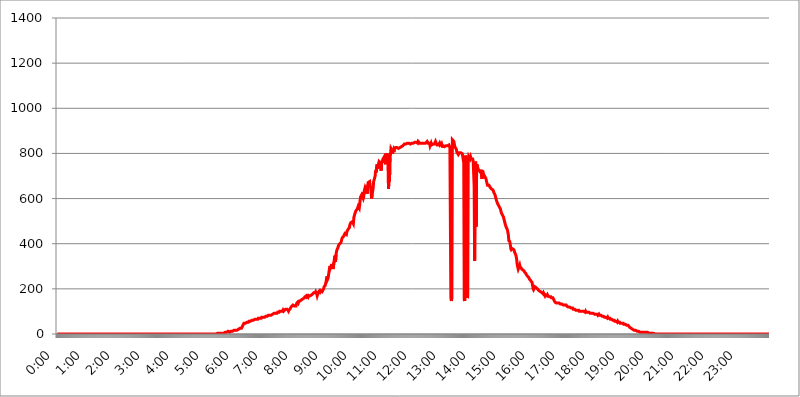
| Category | 2017.08.03. Intenzitás [W/m^2] |
|---|---|
| 0.0 | 0 |
| 0.0006944444444444445 | 0 |
| 0.001388888888888889 | 0 |
| 0.0020833333333333333 | 0 |
| 0.002777777777777778 | 0 |
| 0.003472222222222222 | 0 |
| 0.004166666666666667 | 0 |
| 0.004861111111111111 | 0 |
| 0.005555555555555556 | 0 |
| 0.0062499999999999995 | 0 |
| 0.006944444444444444 | 0 |
| 0.007638888888888889 | 0 |
| 0.008333333333333333 | 0 |
| 0.009027777777777779 | 0 |
| 0.009722222222222222 | 0 |
| 0.010416666666666666 | 0 |
| 0.011111111111111112 | 0 |
| 0.011805555555555555 | 0 |
| 0.012499999999999999 | 0 |
| 0.013194444444444444 | 0 |
| 0.013888888888888888 | 0 |
| 0.014583333333333332 | 0 |
| 0.015277777777777777 | 0 |
| 0.015972222222222224 | 0 |
| 0.016666666666666666 | 0 |
| 0.017361111111111112 | 0 |
| 0.018055555555555557 | 0 |
| 0.01875 | 0 |
| 0.019444444444444445 | 0 |
| 0.02013888888888889 | 0 |
| 0.020833333333333332 | 0 |
| 0.02152777777777778 | 0 |
| 0.022222222222222223 | 0 |
| 0.02291666666666667 | 0 |
| 0.02361111111111111 | 0 |
| 0.024305555555555556 | 0 |
| 0.024999999999999998 | 0 |
| 0.025694444444444447 | 0 |
| 0.02638888888888889 | 0 |
| 0.027083333333333334 | 0 |
| 0.027777777777777776 | 0 |
| 0.02847222222222222 | 0 |
| 0.029166666666666664 | 0 |
| 0.029861111111111113 | 0 |
| 0.030555555555555555 | 0 |
| 0.03125 | 0 |
| 0.03194444444444445 | 0 |
| 0.03263888888888889 | 0 |
| 0.03333333333333333 | 0 |
| 0.034027777777777775 | 0 |
| 0.034722222222222224 | 0 |
| 0.035416666666666666 | 0 |
| 0.036111111111111115 | 0 |
| 0.03680555555555556 | 0 |
| 0.0375 | 0 |
| 0.03819444444444444 | 0 |
| 0.03888888888888889 | 0 |
| 0.03958333333333333 | 0 |
| 0.04027777777777778 | 0 |
| 0.04097222222222222 | 0 |
| 0.041666666666666664 | 0 |
| 0.042361111111111106 | 0 |
| 0.04305555555555556 | 0 |
| 0.043750000000000004 | 0 |
| 0.044444444444444446 | 0 |
| 0.04513888888888889 | 0 |
| 0.04583333333333334 | 0 |
| 0.04652777777777778 | 0 |
| 0.04722222222222222 | 0 |
| 0.04791666666666666 | 0 |
| 0.04861111111111111 | 0 |
| 0.049305555555555554 | 0 |
| 0.049999999999999996 | 0 |
| 0.05069444444444445 | 0 |
| 0.051388888888888894 | 0 |
| 0.052083333333333336 | 0 |
| 0.05277777777777778 | 0 |
| 0.05347222222222222 | 0 |
| 0.05416666666666667 | 0 |
| 0.05486111111111111 | 0 |
| 0.05555555555555555 | 0 |
| 0.05625 | 0 |
| 0.05694444444444444 | 0 |
| 0.057638888888888885 | 0 |
| 0.05833333333333333 | 0 |
| 0.05902777777777778 | 0 |
| 0.059722222222222225 | 0 |
| 0.06041666666666667 | 0 |
| 0.061111111111111116 | 0 |
| 0.06180555555555556 | 0 |
| 0.0625 | 0 |
| 0.06319444444444444 | 0 |
| 0.06388888888888888 | 0 |
| 0.06458333333333334 | 0 |
| 0.06527777777777778 | 0 |
| 0.06597222222222222 | 0 |
| 0.06666666666666667 | 0 |
| 0.06736111111111111 | 0 |
| 0.06805555555555555 | 0 |
| 0.06874999999999999 | 0 |
| 0.06944444444444443 | 0 |
| 0.07013888888888889 | 0 |
| 0.07083333333333333 | 0 |
| 0.07152777777777779 | 0 |
| 0.07222222222222223 | 0 |
| 0.07291666666666667 | 0 |
| 0.07361111111111111 | 0 |
| 0.07430555555555556 | 0 |
| 0.075 | 0 |
| 0.07569444444444444 | 0 |
| 0.0763888888888889 | 0 |
| 0.07708333333333334 | 0 |
| 0.07777777777777778 | 0 |
| 0.07847222222222222 | 0 |
| 0.07916666666666666 | 0 |
| 0.0798611111111111 | 0 |
| 0.08055555555555556 | 0 |
| 0.08125 | 0 |
| 0.08194444444444444 | 0 |
| 0.08263888888888889 | 0 |
| 0.08333333333333333 | 0 |
| 0.08402777777777777 | 0 |
| 0.08472222222222221 | 0 |
| 0.08541666666666665 | 0 |
| 0.08611111111111112 | 0 |
| 0.08680555555555557 | 0 |
| 0.08750000000000001 | 0 |
| 0.08819444444444445 | 0 |
| 0.08888888888888889 | 0 |
| 0.08958333333333333 | 0 |
| 0.09027777777777778 | 0 |
| 0.09097222222222222 | 0 |
| 0.09166666666666667 | 0 |
| 0.09236111111111112 | 0 |
| 0.09305555555555556 | 0 |
| 0.09375 | 0 |
| 0.09444444444444444 | 0 |
| 0.09513888888888888 | 0 |
| 0.09583333333333333 | 0 |
| 0.09652777777777777 | 0 |
| 0.09722222222222222 | 0 |
| 0.09791666666666667 | 0 |
| 0.09861111111111111 | 0 |
| 0.09930555555555555 | 0 |
| 0.09999999999999999 | 0 |
| 0.10069444444444443 | 0 |
| 0.1013888888888889 | 0 |
| 0.10208333333333335 | 0 |
| 0.10277777777777779 | 0 |
| 0.10347222222222223 | 0 |
| 0.10416666666666667 | 0 |
| 0.10486111111111111 | 0 |
| 0.10555555555555556 | 0 |
| 0.10625 | 0 |
| 0.10694444444444444 | 0 |
| 0.1076388888888889 | 0 |
| 0.10833333333333334 | 0 |
| 0.10902777777777778 | 0 |
| 0.10972222222222222 | 0 |
| 0.1111111111111111 | 0 |
| 0.11180555555555556 | 0 |
| 0.11180555555555556 | 0 |
| 0.1125 | 0 |
| 0.11319444444444444 | 0 |
| 0.11388888888888889 | 0 |
| 0.11458333333333333 | 0 |
| 0.11527777777777777 | 0 |
| 0.11597222222222221 | 0 |
| 0.11666666666666665 | 0 |
| 0.1173611111111111 | 0 |
| 0.11805555555555557 | 0 |
| 0.11944444444444445 | 0 |
| 0.12013888888888889 | 0 |
| 0.12083333333333333 | 0 |
| 0.12152777777777778 | 0 |
| 0.12222222222222223 | 0 |
| 0.12291666666666667 | 0 |
| 0.12291666666666667 | 0 |
| 0.12361111111111112 | 0 |
| 0.12430555555555556 | 0 |
| 0.125 | 0 |
| 0.12569444444444444 | 0 |
| 0.12638888888888888 | 0 |
| 0.12708333333333333 | 0 |
| 0.16875 | 0 |
| 0.12847222222222224 | 0 |
| 0.12916666666666668 | 0 |
| 0.12986111111111112 | 0 |
| 0.13055555555555556 | 0 |
| 0.13125 | 0 |
| 0.13194444444444445 | 0 |
| 0.1326388888888889 | 0 |
| 0.13333333333333333 | 0 |
| 0.13402777777777777 | 0 |
| 0.13402777777777777 | 0 |
| 0.13472222222222222 | 0 |
| 0.13541666666666666 | 0 |
| 0.1361111111111111 | 0 |
| 0.13749999999999998 | 0 |
| 0.13819444444444443 | 0 |
| 0.1388888888888889 | 0 |
| 0.13958333333333334 | 0 |
| 0.14027777777777778 | 0 |
| 0.14097222222222222 | 0 |
| 0.14166666666666666 | 0 |
| 0.1423611111111111 | 0 |
| 0.14305555555555557 | 0 |
| 0.14375000000000002 | 0 |
| 0.14444444444444446 | 0 |
| 0.1451388888888889 | 0 |
| 0.1451388888888889 | 0 |
| 0.14652777777777778 | 0 |
| 0.14722222222222223 | 0 |
| 0.14791666666666667 | 0 |
| 0.1486111111111111 | 0 |
| 0.14930555555555555 | 0 |
| 0.15 | 0 |
| 0.15069444444444444 | 0 |
| 0.15138888888888888 | 0 |
| 0.15208333333333332 | 0 |
| 0.15277777777777776 | 0 |
| 0.15347222222222223 | 0 |
| 0.15416666666666667 | 0 |
| 0.15486111111111112 | 0 |
| 0.15555555555555556 | 0 |
| 0.15625 | 0 |
| 0.15694444444444444 | 0 |
| 0.15763888888888888 | 0 |
| 0.15833333333333333 | 0 |
| 0.15902777777777777 | 0 |
| 0.15972222222222224 | 0 |
| 0.16041666666666668 | 0 |
| 0.16111111111111112 | 0 |
| 0.16180555555555556 | 0 |
| 0.1625 | 0 |
| 0.16319444444444445 | 0 |
| 0.1638888888888889 | 0 |
| 0.16458333333333333 | 0 |
| 0.16527777777777777 | 0 |
| 0.16597222222222222 | 0 |
| 0.16666666666666666 | 0 |
| 0.1673611111111111 | 0 |
| 0.16805555555555554 | 0 |
| 0.16874999999999998 | 0 |
| 0.16944444444444443 | 0 |
| 0.17013888888888887 | 0 |
| 0.1708333333333333 | 0 |
| 0.17152777777777775 | 0 |
| 0.17222222222222225 | 0 |
| 0.1729166666666667 | 0 |
| 0.17361111111111113 | 0 |
| 0.17430555555555557 | 0 |
| 0.17500000000000002 | 0 |
| 0.17569444444444446 | 0 |
| 0.1763888888888889 | 0 |
| 0.17708333333333334 | 0 |
| 0.17777777777777778 | 0 |
| 0.17847222222222223 | 0 |
| 0.17916666666666667 | 0 |
| 0.1798611111111111 | 0 |
| 0.18055555555555555 | 0 |
| 0.18125 | 0 |
| 0.18194444444444444 | 0 |
| 0.1826388888888889 | 0 |
| 0.18333333333333335 | 0 |
| 0.1840277777777778 | 0 |
| 0.18472222222222223 | 0 |
| 0.18541666666666667 | 0 |
| 0.18611111111111112 | 0 |
| 0.18680555555555556 | 0 |
| 0.1875 | 0 |
| 0.18819444444444444 | 0 |
| 0.18888888888888888 | 0 |
| 0.18958333333333333 | 0 |
| 0.19027777777777777 | 0 |
| 0.1909722222222222 | 0 |
| 0.19166666666666665 | 0 |
| 0.19236111111111112 | 0 |
| 0.19305555555555554 | 0 |
| 0.19375 | 0 |
| 0.19444444444444445 | 0 |
| 0.1951388888888889 | 0 |
| 0.19583333333333333 | 0 |
| 0.19652777777777777 | 0 |
| 0.19722222222222222 | 0 |
| 0.19791666666666666 | 0 |
| 0.1986111111111111 | 0 |
| 0.19930555555555554 | 0 |
| 0.19999999999999998 | 0 |
| 0.20069444444444443 | 0 |
| 0.20138888888888887 | 0 |
| 0.2020833333333333 | 0 |
| 0.2027777777777778 | 0 |
| 0.2034722222222222 | 0 |
| 0.2041666666666667 | 0 |
| 0.20486111111111113 | 0 |
| 0.20555555555555557 | 0 |
| 0.20625000000000002 | 0 |
| 0.20694444444444446 | 0 |
| 0.2076388888888889 | 0 |
| 0.20833333333333334 | 0 |
| 0.20902777777777778 | 0 |
| 0.20972222222222223 | 0 |
| 0.21041666666666667 | 0 |
| 0.2111111111111111 | 0 |
| 0.21180555555555555 | 0 |
| 0.2125 | 0 |
| 0.21319444444444444 | 0 |
| 0.2138888888888889 | 0 |
| 0.21458333333333335 | 0 |
| 0.2152777777777778 | 0 |
| 0.21597222222222223 | 0 |
| 0.21666666666666667 | 0 |
| 0.21736111111111112 | 0 |
| 0.21805555555555556 | 0 |
| 0.21875 | 0 |
| 0.21944444444444444 | 0 |
| 0.22013888888888888 | 0 |
| 0.22083333333333333 | 0 |
| 0.22152777777777777 | 0 |
| 0.2222222222222222 | 0 |
| 0.22291666666666665 | 0 |
| 0.2236111111111111 | 0 |
| 0.22430555555555556 | 0 |
| 0.225 | 3.525 |
| 0.22569444444444445 | 0 |
| 0.2263888888888889 | 3.525 |
| 0.22708333333333333 | 3.525 |
| 0.22777777777777777 | 3.525 |
| 0.22847222222222222 | 3.525 |
| 0.22916666666666666 | 3.525 |
| 0.2298611111111111 | 3.525 |
| 0.23055555555555554 | 3.525 |
| 0.23124999999999998 | 3.525 |
| 0.23194444444444443 | 3.525 |
| 0.23263888888888887 | 3.525 |
| 0.2333333333333333 | 3.525 |
| 0.2340277777777778 | 7.887 |
| 0.2347222222222222 | 7.887 |
| 0.2354166666666667 | 7.887 |
| 0.23611111111111113 | 7.887 |
| 0.23680555555555557 | 7.887 |
| 0.23750000000000002 | 7.887 |
| 0.23819444444444446 | 7.887 |
| 0.2388888888888889 | 7.887 |
| 0.23958333333333334 | 12.257 |
| 0.24027777777777778 | 7.887 |
| 0.24097222222222223 | 12.257 |
| 0.24166666666666667 | 7.887 |
| 0.2423611111111111 | 12.257 |
| 0.24305555555555555 | 12.257 |
| 0.24375 | 12.257 |
| 0.24444444444444446 | 12.257 |
| 0.24513888888888888 | 12.257 |
| 0.24583333333333335 | 12.257 |
| 0.2465277777777778 | 12.257 |
| 0.24722222222222223 | 16.636 |
| 0.24791666666666667 | 16.636 |
| 0.24861111111111112 | 16.636 |
| 0.24930555555555556 | 16.636 |
| 0.25 | 16.636 |
| 0.25069444444444444 | 16.636 |
| 0.2513888888888889 | 16.636 |
| 0.2520833333333333 | 16.636 |
| 0.25277777777777777 | 21.024 |
| 0.2534722222222222 | 21.024 |
| 0.25416666666666665 | 21.024 |
| 0.2548611111111111 | 21.024 |
| 0.2555555555555556 | 21.024 |
| 0.25625000000000003 | 25.419 |
| 0.2569444444444445 | 21.024 |
| 0.2576388888888889 | 25.419 |
| 0.25833333333333336 | 25.419 |
| 0.2590277777777778 | 25.419 |
| 0.25972222222222224 | 29.823 |
| 0.2604166666666667 | 38.653 |
| 0.2611111111111111 | 43.079 |
| 0.26180555555555557 | 47.511 |
| 0.2625 | 47.511 |
| 0.26319444444444445 | 47.511 |
| 0.2638888888888889 | 47.511 |
| 0.26458333333333334 | 47.511 |
| 0.2652777777777778 | 47.511 |
| 0.2659722222222222 | 51.951 |
| 0.26666666666666666 | 51.951 |
| 0.2673611111111111 | 51.951 |
| 0.26805555555555555 | 51.951 |
| 0.26875 | 56.398 |
| 0.26944444444444443 | 56.398 |
| 0.2701388888888889 | 56.398 |
| 0.2708333333333333 | 56.398 |
| 0.27152777777777776 | 56.398 |
| 0.2722222222222222 | 56.398 |
| 0.27291666666666664 | 60.85 |
| 0.2736111111111111 | 60.85 |
| 0.2743055555555555 | 60.85 |
| 0.27499999999999997 | 60.85 |
| 0.27569444444444446 | 60.85 |
| 0.27638888888888885 | 60.85 |
| 0.27708333333333335 | 65.31 |
| 0.2777777777777778 | 65.31 |
| 0.27847222222222223 | 65.31 |
| 0.2791666666666667 | 65.31 |
| 0.2798611111111111 | 65.31 |
| 0.28055555555555556 | 65.31 |
| 0.28125 | 65.31 |
| 0.28194444444444444 | 69.775 |
| 0.2826388888888889 | 69.775 |
| 0.2833333333333333 | 69.775 |
| 0.28402777777777777 | 69.775 |
| 0.2847222222222222 | 69.775 |
| 0.28541666666666665 | 69.775 |
| 0.28611111111111115 | 69.775 |
| 0.28680555555555554 | 74.246 |
| 0.28750000000000003 | 74.246 |
| 0.2881944444444445 | 74.246 |
| 0.2888888888888889 | 74.246 |
| 0.28958333333333336 | 74.246 |
| 0.2902777777777778 | 74.246 |
| 0.29097222222222224 | 74.246 |
| 0.2916666666666667 | 74.246 |
| 0.2923611111111111 | 78.722 |
| 0.29305555555555557 | 78.722 |
| 0.29375 | 78.722 |
| 0.29444444444444445 | 78.722 |
| 0.2951388888888889 | 78.722 |
| 0.29583333333333334 | 83.205 |
| 0.2965277777777778 | 83.205 |
| 0.2972222222222222 | 83.205 |
| 0.29791666666666666 | 83.205 |
| 0.2986111111111111 | 83.205 |
| 0.29930555555555555 | 83.205 |
| 0.3 | 83.205 |
| 0.30069444444444443 | 83.205 |
| 0.3013888888888889 | 83.205 |
| 0.3020833333333333 | 87.692 |
| 0.30277777777777776 | 87.692 |
| 0.3034722222222222 | 87.692 |
| 0.30416666666666664 | 92.184 |
| 0.3048611111111111 | 92.184 |
| 0.3055555555555555 | 92.184 |
| 0.30624999999999997 | 92.184 |
| 0.3069444444444444 | 92.184 |
| 0.3076388888888889 | 92.184 |
| 0.30833333333333335 | 92.184 |
| 0.3090277777777778 | 96.682 |
| 0.30972222222222223 | 96.682 |
| 0.3104166666666667 | 96.682 |
| 0.3111111111111111 | 96.682 |
| 0.31180555555555556 | 101.184 |
| 0.3125 | 101.184 |
| 0.31319444444444444 | 101.184 |
| 0.3138888888888889 | 101.184 |
| 0.3145833333333333 | 101.184 |
| 0.31527777777777777 | 101.184 |
| 0.3159722222222222 | 101.184 |
| 0.31666666666666665 | 105.69 |
| 0.31736111111111115 | 101.184 |
| 0.31805555555555554 | 101.184 |
| 0.31875000000000003 | 105.69 |
| 0.3194444444444445 | 105.69 |
| 0.3201388888888889 | 110.201 |
| 0.32083333333333336 | 110.201 |
| 0.3215277777777778 | 110.201 |
| 0.32222222222222224 | 110.201 |
| 0.3229166666666667 | 110.201 |
| 0.3236111111111111 | 105.69 |
| 0.32430555555555557 | 101.184 |
| 0.325 | 105.69 |
| 0.32569444444444445 | 105.69 |
| 0.3263888888888889 | 110.201 |
| 0.32708333333333334 | 114.716 |
| 0.3277777777777778 | 119.235 |
| 0.3284722222222222 | 119.235 |
| 0.32916666666666666 | 123.758 |
| 0.3298611111111111 | 123.758 |
| 0.33055555555555555 | 128.284 |
| 0.33125 | 128.284 |
| 0.33194444444444443 | 128.284 |
| 0.3326388888888889 | 123.758 |
| 0.3333333333333333 | 123.758 |
| 0.3340277777777778 | 123.758 |
| 0.3347222222222222 | 123.758 |
| 0.3354166666666667 | 132.814 |
| 0.3361111111111111 | 137.347 |
| 0.3368055555555556 | 137.347 |
| 0.33749999999999997 | 141.884 |
| 0.33819444444444446 | 137.347 |
| 0.33888888888888885 | 141.884 |
| 0.33958333333333335 | 141.884 |
| 0.34027777777777773 | 146.423 |
| 0.34097222222222223 | 146.423 |
| 0.3416666666666666 | 146.423 |
| 0.3423611111111111 | 150.964 |
| 0.3430555555555555 | 150.964 |
| 0.34375 | 150.964 |
| 0.3444444444444445 | 155.509 |
| 0.3451388888888889 | 155.509 |
| 0.3458333333333334 | 155.509 |
| 0.34652777777777777 | 160.056 |
| 0.34722222222222227 | 164.605 |
| 0.34791666666666665 | 164.605 |
| 0.34861111111111115 | 164.605 |
| 0.34930555555555554 | 169.156 |
| 0.35000000000000003 | 164.605 |
| 0.3506944444444444 | 164.605 |
| 0.3513888888888889 | 169.156 |
| 0.3520833333333333 | 164.605 |
| 0.3527777777777778 | 169.156 |
| 0.3534722222222222 | 169.156 |
| 0.3541666666666667 | 169.156 |
| 0.3548611111111111 | 169.156 |
| 0.35555555555555557 | 169.156 |
| 0.35625 | 169.156 |
| 0.35694444444444445 | 173.709 |
| 0.3576388888888889 | 173.709 |
| 0.35833333333333334 | 178.264 |
| 0.3590277777777778 | 178.264 |
| 0.3597222222222222 | 182.82 |
| 0.36041666666666666 | 182.82 |
| 0.3611111111111111 | 182.82 |
| 0.36180555555555555 | 182.82 |
| 0.3625 | 187.378 |
| 0.36319444444444443 | 182.82 |
| 0.3638888888888889 | 178.264 |
| 0.3645833333333333 | 169.156 |
| 0.3652777777777778 | 169.156 |
| 0.3659722222222222 | 182.82 |
| 0.3666666666666667 | 187.378 |
| 0.3673611111111111 | 187.378 |
| 0.3680555555555556 | 191.937 |
| 0.36874999999999997 | 187.378 |
| 0.36944444444444446 | 191.937 |
| 0.37013888888888885 | 191.937 |
| 0.37083333333333335 | 191.937 |
| 0.37152777777777773 | 187.378 |
| 0.37222222222222223 | 187.378 |
| 0.3729166666666666 | 187.378 |
| 0.3736111111111111 | 201.058 |
| 0.3743055555555555 | 210.182 |
| 0.375 | 210.182 |
| 0.3756944444444445 | 214.746 |
| 0.3763888888888889 | 214.746 |
| 0.3770833333333334 | 233 |
| 0.37777777777777777 | 246.689 |
| 0.37847222222222227 | 255.813 |
| 0.37916666666666665 | 242.127 |
| 0.37986111111111115 | 246.689 |
| 0.38055555555555554 | 246.689 |
| 0.38125000000000003 | 278.603 |
| 0.3819444444444444 | 292.259 |
| 0.3826388888888889 | 301.354 |
| 0.3833333333333333 | 292.259 |
| 0.3840277777777778 | 296.808 |
| 0.3847222222222222 | 310.44 |
| 0.3854166666666667 | 301.354 |
| 0.3861111111111111 | 296.808 |
| 0.38680555555555557 | 287.709 |
| 0.3875 | 287.709 |
| 0.38819444444444445 | 319.517 |
| 0.3888888888888889 | 337.639 |
| 0.38958333333333334 | 346.682 |
| 0.3902777777777778 | 319.517 |
| 0.3909722222222222 | 351.198 |
| 0.39166666666666666 | 364.728 |
| 0.3923611111111111 | 373.729 |
| 0.39305555555555555 | 378.224 |
| 0.39375 | 382.715 |
| 0.39444444444444443 | 391.685 |
| 0.3951388888888889 | 396.164 |
| 0.3958333333333333 | 396.164 |
| 0.3965277777777778 | 400.638 |
| 0.3972222222222222 | 400.638 |
| 0.3979166666666667 | 405.108 |
| 0.3986111111111111 | 414.035 |
| 0.3993055555555556 | 422.943 |
| 0.39999999999999997 | 427.39 |
| 0.40069444444444446 | 427.39 |
| 0.40138888888888885 | 431.833 |
| 0.40208333333333335 | 431.833 |
| 0.40277777777777773 | 431.833 |
| 0.40347222222222223 | 445.129 |
| 0.4041666666666666 | 445.129 |
| 0.4048611111111111 | 440.702 |
| 0.4055555555555555 | 440.702 |
| 0.40625 | 453.968 |
| 0.4069444444444445 | 458.38 |
| 0.4076388888888889 | 462.786 |
| 0.4083333333333334 | 467.187 |
| 0.40902777777777777 | 467.187 |
| 0.40972222222222227 | 471.582 |
| 0.41041666666666665 | 484.735 |
| 0.41111111111111115 | 489.108 |
| 0.41180555555555554 | 493.475 |
| 0.41250000000000003 | 497.836 |
| 0.4131944444444444 | 489.108 |
| 0.4138888888888889 | 497.836 |
| 0.4145833333333333 | 497.836 |
| 0.4152777777777778 | 489.108 |
| 0.4159722222222222 | 515.223 |
| 0.4166666666666667 | 523.88 |
| 0.4173611111111111 | 532.513 |
| 0.41805555555555557 | 536.82 |
| 0.41875 | 545.416 |
| 0.41944444444444445 | 549.704 |
| 0.4201388888888889 | 541.121 |
| 0.42083333333333334 | 553.986 |
| 0.4215277777777778 | 558.261 |
| 0.4222222222222222 | 566.793 |
| 0.42291666666666666 | 562.53 |
| 0.4236111111111111 | 558.261 |
| 0.42430555555555555 | 575.299 |
| 0.425 | 600.661 |
| 0.42569444444444443 | 609.062 |
| 0.4263888888888889 | 604.864 |
| 0.4270833333333333 | 617.436 |
| 0.4277777777777778 | 617.436 |
| 0.4284722222222222 | 613.252 |
| 0.4291666666666667 | 600.661 |
| 0.4298611111111111 | 609.062 |
| 0.4305555555555556 | 634.105 |
| 0.43124999999999997 | 642.4 |
| 0.43194444444444446 | 650.667 |
| 0.43263888888888885 | 654.791 |
| 0.43333333333333335 | 642.4 |
| 0.43402777777777773 | 638.256 |
| 0.43472222222222223 | 621.613 |
| 0.4354166666666666 | 658.909 |
| 0.4361111111111111 | 671.22 |
| 0.4368055555555555 | 671.22 |
| 0.4375 | 675.311 |
| 0.4381944444444445 | 675.311 |
| 0.4388888888888889 | 658.909 |
| 0.4395833333333334 | 646.537 |
| 0.44027777777777777 | 642.4 |
| 0.44097222222222227 | 600.661 |
| 0.44166666666666665 | 617.436 |
| 0.44236111111111115 | 617.436 |
| 0.44305555555555554 | 646.537 |
| 0.44375000000000003 | 675.311 |
| 0.4444444444444444 | 683.473 |
| 0.4451388888888889 | 687.544 |
| 0.4458333333333333 | 699.717 |
| 0.4465277777777778 | 723.889 |
| 0.4472222222222222 | 715.858 |
| 0.4479166666666667 | 739.877 |
| 0.4486111111111111 | 751.803 |
| 0.44930555555555557 | 731.896 |
| 0.45 | 739.877 |
| 0.45069444444444445 | 755.766 |
| 0.4513888888888889 | 763.674 |
| 0.45208333333333334 | 763.674 |
| 0.4527777777777778 | 759.723 |
| 0.4534722222222222 | 755.766 |
| 0.45416666666666666 | 723.889 |
| 0.4548611111111111 | 751.803 |
| 0.45555555555555555 | 767.62 |
| 0.45625 | 759.723 |
| 0.45694444444444443 | 775.492 |
| 0.4576388888888889 | 779.42 |
| 0.4583333333333333 | 783.342 |
| 0.4590277777777778 | 779.42 |
| 0.4597222222222222 | 767.62 |
| 0.4604166666666667 | 751.803 |
| 0.4611111111111111 | 798.974 |
| 0.4618055555555556 | 779.42 |
| 0.46249999999999997 | 798.974 |
| 0.46319444444444446 | 791.169 |
| 0.46388888888888885 | 751.803 |
| 0.46458333333333335 | 642.4 |
| 0.46527777777777773 | 687.544 |
| 0.46597222222222223 | 675.311 |
| 0.4666666666666666 | 783.342 |
| 0.4673611111111111 | 795.074 |
| 0.4680555555555555 | 822.26 |
| 0.46875 | 818.392 |
| 0.4694444444444445 | 814.519 |
| 0.4701388888888889 | 798.974 |
| 0.4708333333333334 | 802.868 |
| 0.47152777777777777 | 814.519 |
| 0.47222222222222227 | 806.757 |
| 0.47291666666666665 | 818.392 |
| 0.47361111111111115 | 822.26 |
| 0.47430555555555554 | 826.123 |
| 0.47500000000000003 | 822.26 |
| 0.4756944444444444 | 826.123 |
| 0.4763888888888889 | 826.123 |
| 0.4770833333333333 | 826.123 |
| 0.4777777777777778 | 826.123 |
| 0.4784722222222222 | 822.26 |
| 0.4791666666666667 | 826.123 |
| 0.4798611111111111 | 826.123 |
| 0.48055555555555557 | 826.123 |
| 0.48125 | 829.981 |
| 0.48194444444444445 | 829.981 |
| 0.4826388888888889 | 829.981 |
| 0.48333333333333334 | 829.981 |
| 0.4840277777777778 | 829.981 |
| 0.4847222222222222 | 833.834 |
| 0.48541666666666666 | 833.834 |
| 0.4861111111111111 | 833.834 |
| 0.48680555555555555 | 841.526 |
| 0.4875 | 841.526 |
| 0.48819444444444443 | 837.682 |
| 0.4888888888888889 | 841.526 |
| 0.4895833333333333 | 841.526 |
| 0.4902777777777778 | 845.365 |
| 0.4909722222222222 | 845.365 |
| 0.4916666666666667 | 845.365 |
| 0.4923611111111111 | 845.365 |
| 0.4930555555555556 | 845.365 |
| 0.49374999999999997 | 841.526 |
| 0.49444444444444446 | 841.526 |
| 0.49513888888888885 | 841.526 |
| 0.49583333333333335 | 845.365 |
| 0.49652777777777773 | 841.526 |
| 0.49722222222222223 | 845.365 |
| 0.4979166666666666 | 845.365 |
| 0.4986111111111111 | 845.365 |
| 0.4993055555555555 | 845.365 |
| 0.5 | 845.365 |
| 0.5006944444444444 | 845.365 |
| 0.5013888888888889 | 849.199 |
| 0.5020833333333333 | 849.199 |
| 0.5027777777777778 | 849.199 |
| 0.5034722222222222 | 849.199 |
| 0.5041666666666667 | 853.029 |
| 0.5048611111111111 | 849.199 |
| 0.5055555555555555 | 845.365 |
| 0.50625 | 853.029 |
| 0.5069444444444444 | 853.029 |
| 0.5076388888888889 | 849.199 |
| 0.5083333333333333 | 845.365 |
| 0.5090277777777777 | 845.365 |
| 0.5097222222222222 | 845.365 |
| 0.5104166666666666 | 845.365 |
| 0.5111111111111112 | 845.365 |
| 0.5118055555555555 | 849.199 |
| 0.5125000000000001 | 845.365 |
| 0.5131944444444444 | 845.365 |
| 0.513888888888889 | 849.199 |
| 0.5145833333333333 | 845.365 |
| 0.5152777777777778 | 841.526 |
| 0.5159722222222222 | 845.365 |
| 0.5166666666666667 | 845.365 |
| 0.517361111111111 | 845.365 |
| 0.5180555555555556 | 849.199 |
| 0.5187499999999999 | 853.029 |
| 0.5194444444444445 | 853.029 |
| 0.5201388888888888 | 845.365 |
| 0.5208333333333334 | 845.365 |
| 0.5215277777777778 | 845.365 |
| 0.5222222222222223 | 845.365 |
| 0.5229166666666667 | 833.834 |
| 0.5236111111111111 | 833.834 |
| 0.5243055555555556 | 845.365 |
| 0.525 | 837.682 |
| 0.5256944444444445 | 837.682 |
| 0.5263888888888889 | 841.526 |
| 0.5270833333333333 | 841.526 |
| 0.5277777777777778 | 841.526 |
| 0.5284722222222222 | 845.365 |
| 0.5291666666666667 | 841.526 |
| 0.5298611111111111 | 845.365 |
| 0.5305555555555556 | 853.029 |
| 0.53125 | 853.029 |
| 0.5319444444444444 | 849.199 |
| 0.5326388888888889 | 837.682 |
| 0.5333333333333333 | 837.682 |
| 0.5340277777777778 | 837.682 |
| 0.5347222222222222 | 837.682 |
| 0.5354166666666667 | 837.682 |
| 0.5361111111111111 | 845.365 |
| 0.5368055555555555 | 837.682 |
| 0.5375 | 841.526 |
| 0.5381944444444444 | 837.682 |
| 0.5388888888888889 | 845.365 |
| 0.5395833333333333 | 837.682 |
| 0.5402777777777777 | 826.123 |
| 0.5409722222222222 | 833.834 |
| 0.5416666666666666 | 837.682 |
| 0.5423611111111112 | 829.981 |
| 0.5430555555555555 | 829.981 |
| 0.5437500000000001 | 829.981 |
| 0.5444444444444444 | 829.981 |
| 0.545138888888889 | 833.834 |
| 0.5458333333333333 | 837.682 |
| 0.5465277777777778 | 829.981 |
| 0.5472222222222222 | 833.834 |
| 0.5479166666666667 | 837.682 |
| 0.548611111111111 | 837.682 |
| 0.5493055555555556 | 837.682 |
| 0.5499999999999999 | 833.834 |
| 0.5506944444444445 | 826.123 |
| 0.5513888888888888 | 826.123 |
| 0.5520833333333334 | 160.056 |
| 0.5527777777777778 | 146.423 |
| 0.5534722222222223 | 164.605 |
| 0.5541666666666667 | 860.676 |
| 0.5548611111111111 | 864.493 |
| 0.5555555555555556 | 856.855 |
| 0.55625 | 853.029 |
| 0.5569444444444445 | 841.526 |
| 0.5576388888888889 | 829.981 |
| 0.5583333333333333 | 833.834 |
| 0.5590277777777778 | 829.981 |
| 0.5597222222222222 | 818.392 |
| 0.5604166666666667 | 806.757 |
| 0.5611111111111111 | 802.868 |
| 0.5618055555555556 | 806.757 |
| 0.5625 | 795.074 |
| 0.5631944444444444 | 798.974 |
| 0.5638888888888889 | 802.868 |
| 0.5645833333333333 | 798.974 |
| 0.5652777777777778 | 802.868 |
| 0.5659722222222222 | 802.868 |
| 0.5666666666666667 | 798.974 |
| 0.5673611111111111 | 802.868 |
| 0.5680555555555555 | 798.974 |
| 0.56875 | 798.974 |
| 0.5694444444444444 | 795.074 |
| 0.5701388888888889 | 759.723 |
| 0.5708333333333333 | 150.964 |
| 0.5715277777777777 | 146.423 |
| 0.5722222222222222 | 703.762 |
| 0.5729166666666666 | 791.169 |
| 0.5736111111111112 | 791.169 |
| 0.5743055555555555 | 787.258 |
| 0.5750000000000001 | 160.056 |
| 0.5756944444444444 | 164.605 |
| 0.576388888888889 | 767.62 |
| 0.5770833333333333 | 787.258 |
| 0.5777777777777778 | 783.342 |
| 0.5784722222222222 | 783.342 |
| 0.5791666666666667 | 775.492 |
| 0.579861111111111 | 783.342 |
| 0.5805555555555556 | 775.492 |
| 0.5812499999999999 | 775.492 |
| 0.5819444444444445 | 775.492 |
| 0.5826388888888888 | 775.492 |
| 0.5833333333333334 | 767.62 |
| 0.5840277777777778 | 763.674 |
| 0.5847222222222223 | 654.791 |
| 0.5854166666666667 | 324.052 |
| 0.5861111111111111 | 743.859 |
| 0.5868055555555556 | 763.674 |
| 0.5875 | 475.972 |
| 0.5881944444444445 | 751.803 |
| 0.5888888888888889 | 747.834 |
| 0.5895833333333333 | 739.877 |
| 0.5902777777777778 | 731.896 |
| 0.5909722222222222 | 731.896 |
| 0.5916666666666667 | 723.889 |
| 0.5923611111111111 | 719.877 |
| 0.5930555555555556 | 723.889 |
| 0.59375 | 715.858 |
| 0.5944444444444444 | 727.896 |
| 0.5951388888888889 | 727.896 |
| 0.5958333333333333 | 687.544 |
| 0.5965277777777778 | 723.889 |
| 0.5972222222222222 | 711.832 |
| 0.5979166666666667 | 711.832 |
| 0.5986111111111111 | 703.762 |
| 0.5993055555555555 | 699.717 |
| 0.6 | 695.666 |
| 0.6006944444444444 | 691.608 |
| 0.6013888888888889 | 687.544 |
| 0.6020833333333333 | 675.311 |
| 0.6027777777777777 | 675.311 |
| 0.6034722222222222 | 658.909 |
| 0.6041666666666666 | 658.909 |
| 0.6048611111111112 | 658.909 |
| 0.6055555555555555 | 658.909 |
| 0.6062500000000001 | 654.791 |
| 0.6069444444444444 | 650.667 |
| 0.607638888888889 | 646.537 |
| 0.6083333333333333 | 646.537 |
| 0.6090277777777778 | 642.4 |
| 0.6097222222222222 | 638.256 |
| 0.6104166666666667 | 642.4 |
| 0.611111111111111 | 638.256 |
| 0.6118055555555556 | 634.105 |
| 0.6124999999999999 | 625.784 |
| 0.6131944444444445 | 621.613 |
| 0.6138888888888888 | 617.436 |
| 0.6145833333333334 | 609.062 |
| 0.6152777777777778 | 600.661 |
| 0.6159722222222223 | 592.233 |
| 0.6166666666666667 | 588.009 |
| 0.6173611111111111 | 579.542 |
| 0.6180555555555556 | 575.299 |
| 0.61875 | 571.049 |
| 0.6194444444444445 | 566.793 |
| 0.6201388888888889 | 562.53 |
| 0.6208333333333333 | 558.261 |
| 0.6215277777777778 | 553.986 |
| 0.6222222222222222 | 545.416 |
| 0.6229166666666667 | 536.82 |
| 0.6236111111111111 | 532.513 |
| 0.6243055555555556 | 528.2 |
| 0.625 | 523.88 |
| 0.6256944444444444 | 519.555 |
| 0.6263888888888889 | 510.885 |
| 0.6270833333333333 | 502.192 |
| 0.6277777777777778 | 493.475 |
| 0.6284722222222222 | 484.735 |
| 0.6291666666666667 | 480.356 |
| 0.6298611111111111 | 471.582 |
| 0.6305555555555555 | 471.582 |
| 0.63125 | 462.786 |
| 0.6319444444444444 | 458.38 |
| 0.6326388888888889 | 440.702 |
| 0.6333333333333333 | 414.035 |
| 0.6340277777777777 | 414.035 |
| 0.6347222222222222 | 409.574 |
| 0.6354166666666666 | 396.164 |
| 0.6361111111111112 | 378.224 |
| 0.6368055555555555 | 373.729 |
| 0.6375000000000001 | 373.729 |
| 0.6381944444444444 | 378.224 |
| 0.638888888888889 | 378.224 |
| 0.6395833333333333 | 378.224 |
| 0.6402777777777778 | 373.729 |
| 0.6409722222222222 | 369.23 |
| 0.6416666666666667 | 360.221 |
| 0.642361111111111 | 360.221 |
| 0.6430555555555556 | 351.198 |
| 0.6437499999999999 | 342.162 |
| 0.6444444444444445 | 328.584 |
| 0.6451388888888888 | 305.898 |
| 0.6458333333333334 | 296.808 |
| 0.6465277777777778 | 287.709 |
| 0.6472222222222223 | 287.709 |
| 0.6479166666666667 | 287.709 |
| 0.6486111111111111 | 305.898 |
| 0.6493055555555556 | 296.808 |
| 0.65 | 296.808 |
| 0.6506944444444445 | 292.259 |
| 0.6513888888888889 | 287.709 |
| 0.6520833333333333 | 287.709 |
| 0.6527777777777778 | 287.709 |
| 0.6534722222222222 | 283.156 |
| 0.6541666666666667 | 283.156 |
| 0.6548611111111111 | 278.603 |
| 0.6555555555555556 | 274.047 |
| 0.65625 | 274.047 |
| 0.6569444444444444 | 269.49 |
| 0.6576388888888889 | 264.932 |
| 0.6583333333333333 | 260.373 |
| 0.6590277777777778 | 260.373 |
| 0.6597222222222222 | 255.813 |
| 0.6604166666666667 | 255.813 |
| 0.6611111111111111 | 251.251 |
| 0.6618055555555555 | 246.689 |
| 0.6625 | 242.127 |
| 0.6631944444444444 | 242.127 |
| 0.6638888888888889 | 237.564 |
| 0.6645833333333333 | 233 |
| 0.6652777777777777 | 233 |
| 0.6659722222222222 | 228.436 |
| 0.6666666666666666 | 214.746 |
| 0.6673611111111111 | 201.058 |
| 0.6680555555555556 | 196.497 |
| 0.6687500000000001 | 201.058 |
| 0.6694444444444444 | 210.182 |
| 0.6701388888888888 | 210.182 |
| 0.6708333333333334 | 210.182 |
| 0.6715277777777778 | 205.62 |
| 0.6722222222222222 | 205.62 |
| 0.6729166666666666 | 201.058 |
| 0.6736111111111112 | 201.058 |
| 0.6743055555555556 | 196.497 |
| 0.6749999999999999 | 196.497 |
| 0.6756944444444444 | 191.937 |
| 0.6763888888888889 | 191.937 |
| 0.6770833333333334 | 191.937 |
| 0.6777777777777777 | 187.378 |
| 0.6784722222222223 | 187.378 |
| 0.6791666666666667 | 187.378 |
| 0.6798611111111111 | 182.82 |
| 0.6805555555555555 | 182.82 |
| 0.68125 | 178.264 |
| 0.6819444444444445 | 182.82 |
| 0.6826388888888889 | 178.264 |
| 0.6833333333333332 | 178.264 |
| 0.6840277777777778 | 169.156 |
| 0.6847222222222222 | 173.709 |
| 0.6854166666666667 | 173.709 |
| 0.686111111111111 | 173.709 |
| 0.6868055555555556 | 169.156 |
| 0.6875 | 173.709 |
| 0.6881944444444444 | 169.156 |
| 0.688888888888889 | 169.156 |
| 0.6895833333333333 | 169.156 |
| 0.6902777777777778 | 164.605 |
| 0.6909722222222222 | 164.605 |
| 0.6916666666666668 | 164.605 |
| 0.6923611111111111 | 164.605 |
| 0.6930555555555555 | 160.056 |
| 0.69375 | 160.056 |
| 0.6944444444444445 | 160.056 |
| 0.6951388888888889 | 160.056 |
| 0.6958333333333333 | 155.509 |
| 0.6965277777777777 | 150.964 |
| 0.6972222222222223 | 146.423 |
| 0.6979166666666666 | 141.884 |
| 0.6986111111111111 | 141.884 |
| 0.6993055555555556 | 141.884 |
| 0.7000000000000001 | 137.347 |
| 0.7006944444444444 | 137.347 |
| 0.7013888888888888 | 137.347 |
| 0.7020833333333334 | 137.347 |
| 0.7027777777777778 | 137.347 |
| 0.7034722222222222 | 137.347 |
| 0.7041666666666666 | 137.347 |
| 0.7048611111111112 | 137.347 |
| 0.7055555555555556 | 132.814 |
| 0.7062499999999999 | 132.814 |
| 0.7069444444444444 | 132.814 |
| 0.7076388888888889 | 132.814 |
| 0.7083333333333334 | 132.814 |
| 0.7090277777777777 | 132.814 |
| 0.7097222222222223 | 128.284 |
| 0.7104166666666667 | 128.284 |
| 0.7111111111111111 | 128.284 |
| 0.7118055555555555 | 128.284 |
| 0.7125 | 128.284 |
| 0.7131944444444445 | 128.284 |
| 0.7138888888888889 | 128.284 |
| 0.7145833333333332 | 123.758 |
| 0.7152777777777778 | 123.758 |
| 0.7159722222222222 | 123.758 |
| 0.7166666666666667 | 119.235 |
| 0.717361111111111 | 119.235 |
| 0.7180555555555556 | 119.235 |
| 0.71875 | 119.235 |
| 0.7194444444444444 | 119.235 |
| 0.720138888888889 | 119.235 |
| 0.7208333333333333 | 114.716 |
| 0.7215277777777778 | 114.716 |
| 0.7222222222222222 | 114.716 |
| 0.7229166666666668 | 114.716 |
| 0.7236111111111111 | 110.201 |
| 0.7243055555555555 | 110.201 |
| 0.725 | 110.201 |
| 0.7256944444444445 | 110.201 |
| 0.7263888888888889 | 110.201 |
| 0.7270833333333333 | 105.69 |
| 0.7277777777777777 | 105.69 |
| 0.7284722222222223 | 105.69 |
| 0.7291666666666666 | 105.69 |
| 0.7298611111111111 | 105.69 |
| 0.7305555555555556 | 105.69 |
| 0.7312500000000001 | 105.69 |
| 0.7319444444444444 | 101.184 |
| 0.7326388888888888 | 101.184 |
| 0.7333333333333334 | 101.184 |
| 0.7340277777777778 | 101.184 |
| 0.7347222222222222 | 101.184 |
| 0.7354166666666666 | 101.184 |
| 0.7361111111111112 | 101.184 |
| 0.7368055555555556 | 101.184 |
| 0.7374999999999999 | 101.184 |
| 0.7381944444444444 | 101.184 |
| 0.7388888888888889 | 101.184 |
| 0.7395833333333334 | 101.184 |
| 0.7402777777777777 | 96.682 |
| 0.7409722222222223 | 101.184 |
| 0.7416666666666667 | 96.682 |
| 0.7423611111111111 | 96.682 |
| 0.7430555555555555 | 96.682 |
| 0.74375 | 96.682 |
| 0.7444444444444445 | 96.682 |
| 0.7451388888888889 | 96.682 |
| 0.7458333333333332 | 96.682 |
| 0.7465277777777778 | 96.682 |
| 0.7472222222222222 | 92.184 |
| 0.7479166666666667 | 92.184 |
| 0.748611111111111 | 92.184 |
| 0.7493055555555556 | 92.184 |
| 0.75 | 92.184 |
| 0.7506944444444444 | 92.184 |
| 0.751388888888889 | 92.184 |
| 0.7520833333333333 | 92.184 |
| 0.7527777777777778 | 92.184 |
| 0.7534722222222222 | 87.692 |
| 0.7541666666666668 | 87.692 |
| 0.7548611111111111 | 87.692 |
| 0.7555555555555555 | 87.692 |
| 0.75625 | 87.692 |
| 0.7569444444444445 | 87.692 |
| 0.7576388888888889 | 87.692 |
| 0.7583333333333333 | 83.205 |
| 0.7590277777777777 | 83.205 |
| 0.7597222222222223 | 87.692 |
| 0.7604166666666666 | 83.205 |
| 0.7611111111111111 | 83.205 |
| 0.7618055555555556 | 83.205 |
| 0.7625000000000001 | 83.205 |
| 0.7631944444444444 | 83.205 |
| 0.7638888888888888 | 78.722 |
| 0.7645833333333334 | 78.722 |
| 0.7652777777777778 | 78.722 |
| 0.7659722222222222 | 78.722 |
| 0.7666666666666666 | 78.722 |
| 0.7673611111111112 | 74.246 |
| 0.7680555555555556 | 74.246 |
| 0.7687499999999999 | 74.246 |
| 0.7694444444444444 | 74.246 |
| 0.7701388888888889 | 74.246 |
| 0.7708333333333334 | 74.246 |
| 0.7715277777777777 | 69.775 |
| 0.7722222222222223 | 74.246 |
| 0.7729166666666667 | 69.775 |
| 0.7736111111111111 | 69.775 |
| 0.7743055555555555 | 69.775 |
| 0.775 | 69.775 |
| 0.7756944444444445 | 65.31 |
| 0.7763888888888889 | 65.31 |
| 0.7770833333333332 | 65.31 |
| 0.7777777777777778 | 65.31 |
| 0.7784722222222222 | 65.31 |
| 0.7791666666666667 | 60.85 |
| 0.779861111111111 | 60.85 |
| 0.7805555555555556 | 60.85 |
| 0.78125 | 60.85 |
| 0.7819444444444444 | 56.398 |
| 0.782638888888889 | 56.398 |
| 0.7833333333333333 | 56.398 |
| 0.7840277777777778 | 56.398 |
| 0.7847222222222222 | 56.398 |
| 0.7854166666666668 | 51.951 |
| 0.7861111111111111 | 56.398 |
| 0.7868055555555555 | 51.951 |
| 0.7875 | 51.951 |
| 0.7881944444444445 | 51.951 |
| 0.7888888888888889 | 51.951 |
| 0.7895833333333333 | 47.511 |
| 0.7902777777777777 | 47.511 |
| 0.7909722222222223 | 47.511 |
| 0.7916666666666666 | 47.511 |
| 0.7923611111111111 | 47.511 |
| 0.7930555555555556 | 47.511 |
| 0.7937500000000001 | 47.511 |
| 0.7944444444444444 | 43.079 |
| 0.7951388888888888 | 43.079 |
| 0.7958333333333334 | 43.079 |
| 0.7965277777777778 | 43.079 |
| 0.7972222222222222 | 43.079 |
| 0.7979166666666666 | 38.653 |
| 0.7986111111111112 | 38.653 |
| 0.7993055555555556 | 38.653 |
| 0.7999999999999999 | 38.653 |
| 0.8006944444444444 | 38.653 |
| 0.8013888888888889 | 34.234 |
| 0.8020833333333334 | 34.234 |
| 0.8027777777777777 | 29.823 |
| 0.8034722222222223 | 29.823 |
| 0.8041666666666667 | 25.419 |
| 0.8048611111111111 | 25.419 |
| 0.8055555555555555 | 25.419 |
| 0.80625 | 21.024 |
| 0.8069444444444445 | 21.024 |
| 0.8076388888888889 | 21.024 |
| 0.8083333333333332 | 21.024 |
| 0.8090277777777778 | 16.636 |
| 0.8097222222222222 | 16.636 |
| 0.8104166666666667 | 16.636 |
| 0.811111111111111 | 16.636 |
| 0.8118055555555556 | 12.257 |
| 0.8125 | 12.257 |
| 0.8131944444444444 | 12.257 |
| 0.813888888888889 | 12.257 |
| 0.8145833333333333 | 12.257 |
| 0.8152777777777778 | 12.257 |
| 0.8159722222222222 | 7.887 |
| 0.8166666666666668 | 7.887 |
| 0.8173611111111111 | 7.887 |
| 0.8180555555555555 | 7.887 |
| 0.81875 | 7.887 |
| 0.8194444444444445 | 7.887 |
| 0.8201388888888889 | 7.887 |
| 0.8208333333333333 | 7.887 |
| 0.8215277777777777 | 7.887 |
| 0.8222222222222223 | 7.887 |
| 0.8229166666666666 | 7.887 |
| 0.8236111111111111 | 7.887 |
| 0.8243055555555556 | 7.887 |
| 0.8250000000000001 | 7.887 |
| 0.8256944444444444 | 7.887 |
| 0.8263888888888888 | 7.887 |
| 0.8270833333333334 | 7.887 |
| 0.8277777777777778 | 7.887 |
| 0.8284722222222222 | 7.887 |
| 0.8291666666666666 | 7.887 |
| 0.8298611111111112 | 3.525 |
| 0.8305555555555556 | 7.887 |
| 0.8312499999999999 | 3.525 |
| 0.8319444444444444 | 3.525 |
| 0.8326388888888889 | 3.525 |
| 0.8333333333333334 | 3.525 |
| 0.8340277777777777 | 3.525 |
| 0.8347222222222223 | 3.525 |
| 0.8354166666666667 | 3.525 |
| 0.8361111111111111 | 3.525 |
| 0.8368055555555555 | 3.525 |
| 0.8375 | 3.525 |
| 0.8381944444444445 | 0 |
| 0.8388888888888889 | 0 |
| 0.8395833333333332 | 0 |
| 0.8402777777777778 | 0 |
| 0.8409722222222222 | 0 |
| 0.8416666666666667 | 0 |
| 0.842361111111111 | 0 |
| 0.8430555555555556 | 0 |
| 0.84375 | 0 |
| 0.8444444444444444 | 0 |
| 0.845138888888889 | 0 |
| 0.8458333333333333 | 0 |
| 0.8465277777777778 | 0 |
| 0.8472222222222222 | 0 |
| 0.8479166666666668 | 0 |
| 0.8486111111111111 | 0 |
| 0.8493055555555555 | 0 |
| 0.85 | 0 |
| 0.8506944444444445 | 0 |
| 0.8513888888888889 | 0 |
| 0.8520833333333333 | 0 |
| 0.8527777777777777 | 0 |
| 0.8534722222222223 | 0 |
| 0.8541666666666666 | 0 |
| 0.8548611111111111 | 0 |
| 0.8555555555555556 | 0 |
| 0.8562500000000001 | 0 |
| 0.8569444444444444 | 0 |
| 0.8576388888888888 | 0 |
| 0.8583333333333334 | 0 |
| 0.8590277777777778 | 0 |
| 0.8597222222222222 | 0 |
| 0.8604166666666666 | 0 |
| 0.8611111111111112 | 0 |
| 0.8618055555555556 | 0 |
| 0.8624999999999999 | 0 |
| 0.8631944444444444 | 0 |
| 0.8638888888888889 | 0 |
| 0.8645833333333334 | 0 |
| 0.8652777777777777 | 0 |
| 0.8659722222222223 | 0 |
| 0.8666666666666667 | 0 |
| 0.8673611111111111 | 0 |
| 0.8680555555555555 | 0 |
| 0.86875 | 0 |
| 0.8694444444444445 | 0 |
| 0.8701388888888889 | 0 |
| 0.8708333333333332 | 0 |
| 0.8715277777777778 | 0 |
| 0.8722222222222222 | 0 |
| 0.8729166666666667 | 0 |
| 0.873611111111111 | 0 |
| 0.8743055555555556 | 0 |
| 0.875 | 0 |
| 0.8756944444444444 | 0 |
| 0.876388888888889 | 0 |
| 0.8770833333333333 | 0 |
| 0.8777777777777778 | 0 |
| 0.8784722222222222 | 0 |
| 0.8791666666666668 | 0 |
| 0.8798611111111111 | 0 |
| 0.8805555555555555 | 0 |
| 0.88125 | 0 |
| 0.8819444444444445 | 0 |
| 0.8826388888888889 | 0 |
| 0.8833333333333333 | 0 |
| 0.8840277777777777 | 0 |
| 0.8847222222222223 | 0 |
| 0.8854166666666666 | 0 |
| 0.8861111111111111 | 0 |
| 0.8868055555555556 | 0 |
| 0.8875000000000001 | 0 |
| 0.8881944444444444 | 0 |
| 0.8888888888888888 | 0 |
| 0.8895833333333334 | 0 |
| 0.8902777777777778 | 0 |
| 0.8909722222222222 | 0 |
| 0.8916666666666666 | 0 |
| 0.8923611111111112 | 0 |
| 0.8930555555555556 | 0 |
| 0.8937499999999999 | 0 |
| 0.8944444444444444 | 0 |
| 0.8951388888888889 | 0 |
| 0.8958333333333334 | 0 |
| 0.8965277777777777 | 0 |
| 0.8972222222222223 | 0 |
| 0.8979166666666667 | 0 |
| 0.8986111111111111 | 0 |
| 0.8993055555555555 | 0 |
| 0.9 | 0 |
| 0.9006944444444445 | 0 |
| 0.9013888888888889 | 0 |
| 0.9020833333333332 | 0 |
| 0.9027777777777778 | 0 |
| 0.9034722222222222 | 0 |
| 0.9041666666666667 | 0 |
| 0.904861111111111 | 0 |
| 0.9055555555555556 | 0 |
| 0.90625 | 0 |
| 0.9069444444444444 | 0 |
| 0.907638888888889 | 0 |
| 0.9083333333333333 | 0 |
| 0.9090277777777778 | 0 |
| 0.9097222222222222 | 0 |
| 0.9104166666666668 | 0 |
| 0.9111111111111111 | 0 |
| 0.9118055555555555 | 0 |
| 0.9125 | 0 |
| 0.9131944444444445 | 0 |
| 0.9138888888888889 | 0 |
| 0.9145833333333333 | 0 |
| 0.9152777777777777 | 0 |
| 0.9159722222222223 | 0 |
| 0.9166666666666666 | 0 |
| 0.9173611111111111 | 0 |
| 0.9180555555555556 | 0 |
| 0.9187500000000001 | 0 |
| 0.9194444444444444 | 0 |
| 0.9201388888888888 | 0 |
| 0.9208333333333334 | 0 |
| 0.9215277777777778 | 0 |
| 0.9222222222222222 | 0 |
| 0.9229166666666666 | 0 |
| 0.9236111111111112 | 0 |
| 0.9243055555555556 | 0 |
| 0.9249999999999999 | 0 |
| 0.9256944444444444 | 0 |
| 0.9263888888888889 | 0 |
| 0.9270833333333334 | 0 |
| 0.9277777777777777 | 0 |
| 0.9284722222222223 | 0 |
| 0.9291666666666667 | 0 |
| 0.9298611111111111 | 0 |
| 0.9305555555555555 | 0 |
| 0.93125 | 0 |
| 0.9319444444444445 | 0 |
| 0.9326388888888889 | 0 |
| 0.9333333333333332 | 0 |
| 0.9340277777777778 | 0 |
| 0.9347222222222222 | 0 |
| 0.9354166666666667 | 0 |
| 0.936111111111111 | 0 |
| 0.9368055555555556 | 0 |
| 0.9375 | 0 |
| 0.9381944444444444 | 0 |
| 0.938888888888889 | 0 |
| 0.9395833333333333 | 0 |
| 0.9402777777777778 | 0 |
| 0.9409722222222222 | 0 |
| 0.9416666666666668 | 0 |
| 0.9423611111111111 | 0 |
| 0.9430555555555555 | 0 |
| 0.94375 | 0 |
| 0.9444444444444445 | 0 |
| 0.9451388888888889 | 0 |
| 0.9458333333333333 | 0 |
| 0.9465277777777777 | 0 |
| 0.9472222222222223 | 0 |
| 0.9479166666666666 | 0 |
| 0.9486111111111111 | 0 |
| 0.9493055555555556 | 0 |
| 0.9500000000000001 | 0 |
| 0.9506944444444444 | 0 |
| 0.9513888888888888 | 0 |
| 0.9520833333333334 | 0 |
| 0.9527777777777778 | 0 |
| 0.9534722222222222 | 0 |
| 0.9541666666666666 | 0 |
| 0.9548611111111112 | 0 |
| 0.9555555555555556 | 0 |
| 0.9562499999999999 | 0 |
| 0.9569444444444444 | 0 |
| 0.9576388888888889 | 0 |
| 0.9583333333333334 | 0 |
| 0.9590277777777777 | 0 |
| 0.9597222222222223 | 0 |
| 0.9604166666666667 | 0 |
| 0.9611111111111111 | 0 |
| 0.9618055555555555 | 0 |
| 0.9625 | 0 |
| 0.9631944444444445 | 0 |
| 0.9638888888888889 | 0 |
| 0.9645833333333332 | 0 |
| 0.9652777777777778 | 0 |
| 0.9659722222222222 | 0 |
| 0.9666666666666667 | 0 |
| 0.967361111111111 | 0 |
| 0.9680555555555556 | 0 |
| 0.96875 | 0 |
| 0.9694444444444444 | 0 |
| 0.970138888888889 | 0 |
| 0.9708333333333333 | 0 |
| 0.9715277777777778 | 0 |
| 0.9722222222222222 | 0 |
| 0.9729166666666668 | 0 |
| 0.9736111111111111 | 0 |
| 0.9743055555555555 | 0 |
| 0.975 | 0 |
| 0.9756944444444445 | 0 |
| 0.9763888888888889 | 0 |
| 0.9770833333333333 | 0 |
| 0.9777777777777777 | 0 |
| 0.9784722222222223 | 0 |
| 0.9791666666666666 | 0 |
| 0.9798611111111111 | 0 |
| 0.9805555555555556 | 0 |
| 0.9812500000000001 | 0 |
| 0.9819444444444444 | 0 |
| 0.9826388888888888 | 0 |
| 0.9833333333333334 | 0 |
| 0.9840277777777778 | 0 |
| 0.9847222222222222 | 0 |
| 0.9854166666666666 | 0 |
| 0.9861111111111112 | 0 |
| 0.9868055555555556 | 0 |
| 0.9874999999999999 | 0 |
| 0.9881944444444444 | 0 |
| 0.9888888888888889 | 0 |
| 0.9895833333333334 | 0 |
| 0.9902777777777777 | 0 |
| 0.9909722222222223 | 0 |
| 0.9916666666666667 | 0 |
| 0.9923611111111111 | 0 |
| 0.9930555555555555 | 0 |
| 0.99375 | 0 |
| 0.9944444444444445 | 0 |
| 0.9951388888888889 | 0 |
| 0.9958333333333332 | 0 |
| 0.9965277777777778 | 0 |
| 0.9972222222222222 | 0 |
| 0.9979166666666667 | 0 |
| 0.998611111111111 | 0 |
| 0.9993055555555556 | 0 |